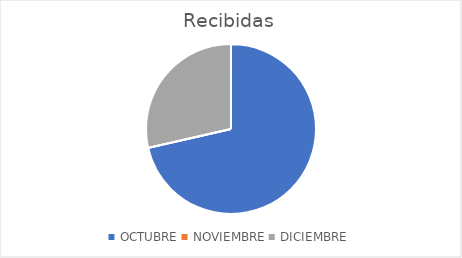
| Category | Recibidas |
|---|---|
| OCTUBRE | 5 |
| NOVIEMBRE | 0 |
| DICIEMBRE | 2 |